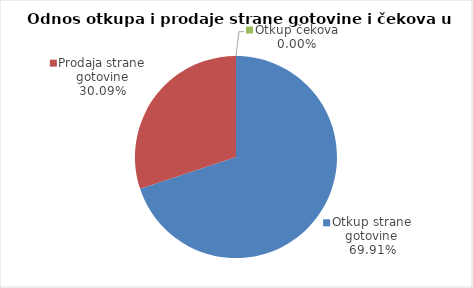
| Category | Series 0 |
|---|---|
| Otkup strane gotovine | 69.914 |
| Prodaja strane gotovine | 30.086 |
| Otkup čekova | 0 |